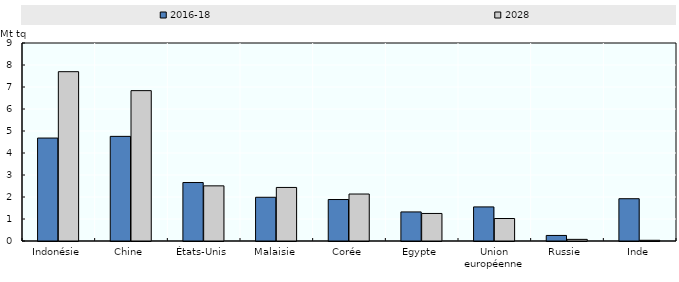
| Category | 2016-18 | 2028 |
|---|---|---|
| Indonésie | 4.679 | 7.696 |
| Chine | 4.756 | 6.835 |
| États-Unis | 2.658 | 2.507 |
| Malaisie | 1.988 | 2.434 |
| Corée | 1.885 | 2.135 |
| Egypte | 1.321 | 1.252 |
| Union européenne | 1.549 | 1.022 |
| Russie | 0.252 | 0.074 |
| Inde | 1.922 | 0.032 |